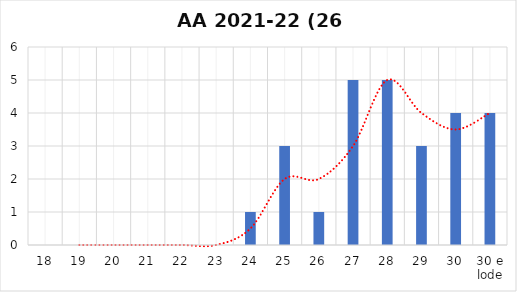
| Category | Series 0 |
|---|---|
| 18 | 0 |
| 19 | 0 |
| 20 | 0 |
| 21 | 0 |
| 22 | 0 |
| 23 | 0 |
| 24 | 1 |
| 25 | 3 |
| 26 | 1 |
| 27 | 5 |
| 28 | 5 |
| 29 | 3 |
| 30 | 4 |
| 30 e lode | 4 |